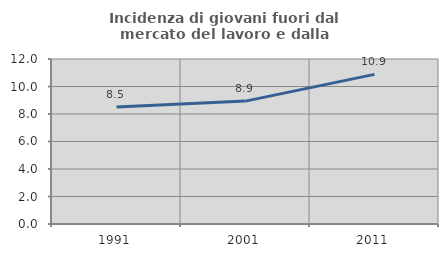
| Category | Incidenza di giovani fuori dal mercato del lavoro e dalla formazione  |
|---|---|
| 1991.0 | 8.509 |
| 2001.0 | 8.938 |
| 2011.0 | 10.88 |